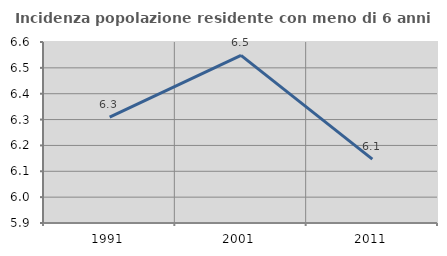
| Category | Incidenza popolazione residente con meno di 6 anni |
|---|---|
| 1991.0 | 6.309 |
| 2001.0 | 6.549 |
| 2011.0 | 6.147 |